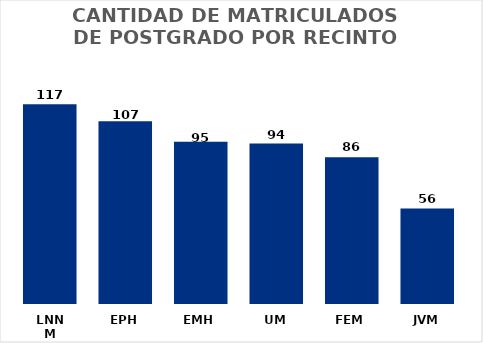
| Category | Series 0 |
|---|---|
| LNNM | 117 |
| EPH | 107 |
| EMH | 95 |
| UM | 94 |
| FEM | 86 |
| JVM | 56 |